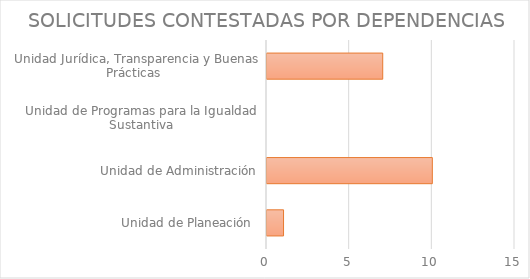
| Category | Series 1 |
|---|---|
| Unidad de Planeación  | 1 |
| Unidad de Administración | 10 |
| Unidad de Programas para la Igualdad Sustantiva | 0 |
| Unidad Jurídica, Transparencia y Buenas Prácticas  | 7 |